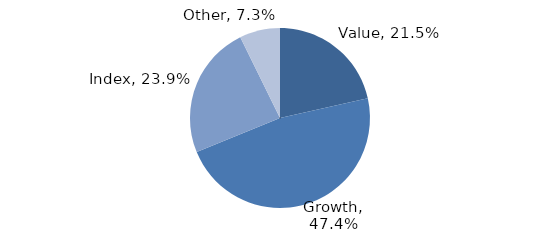
| Category | Investment Style |
|---|---|
| Value | 0.215 |
| Growth | 0.474 |
| Index | 0.239 |
| Other | 0.073 |